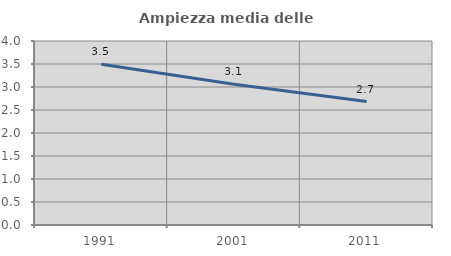
| Category | Ampiezza media delle famiglie |
|---|---|
| 1991.0 | 3.497 |
| 2001.0 | 3.058 |
| 2011.0 | 2.683 |